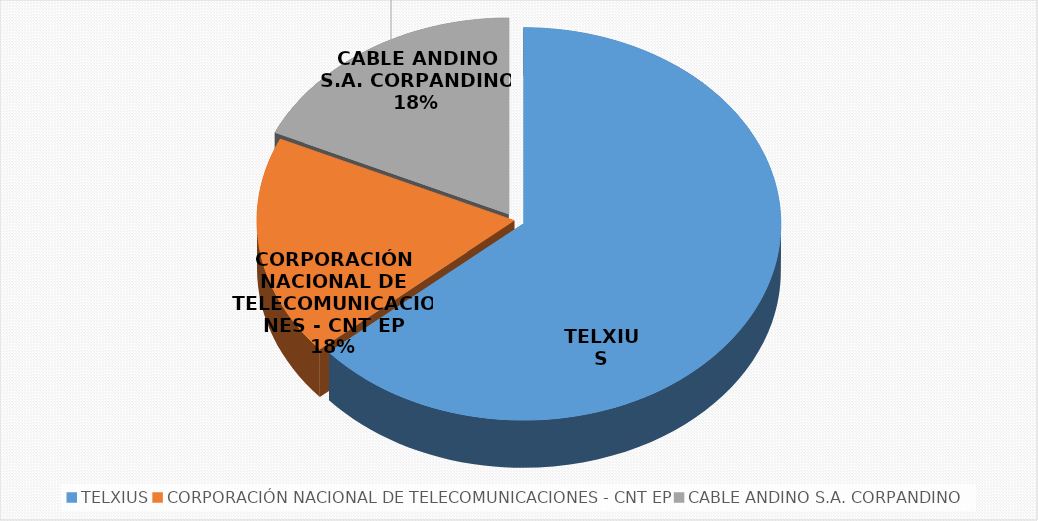
| Category | Series 0 |
|---|---|
| TELXIUS | 7 |
| CORPORACIÓN NACIONAL DE TELECOMUNICACIONES - CNT EP | 2 |
| CABLE ANDINO S.A. CORPANDINO | 2 |